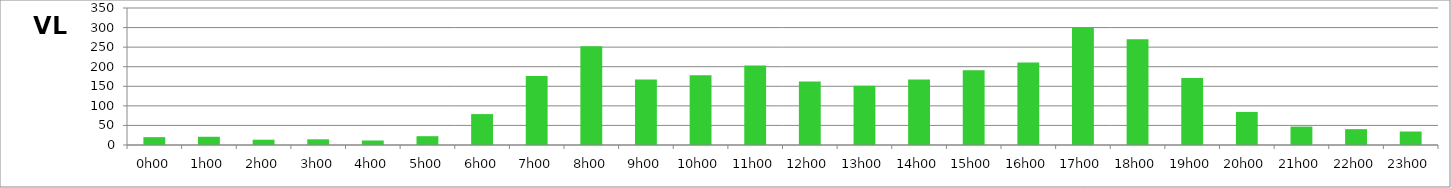
| Category | VL |
|---|---|
| 0.0 | 20 |
| 0.041666666666666664 | 21 |
| 0.08333333333333333 | 13.5 |
| 0.125 | 14.5 |
| 0.16666666666666666 | 11.5 |
| 0.20833333333333334 | 22.5 |
| 0.25 | 79 |
| 0.2916666666666667 | 176.5 |
| 0.3333333333333333 | 252.5 |
| 0.375 | 167.5 |
| 0.4166666666666667 | 178.5 |
| 0.4583333333333333 | 203 |
| 0.5 | 162 |
| 0.5416666666666666 | 151.5 |
| 0.5833333333333334 | 167.5 |
| 0.625 | 191 |
| 0.6666666666666666 | 211 |
| 0.7083333333333334 | 299.5 |
| 0.75 | 270 |
| 0.7916666666666666 | 171 |
| 0.8333333333333334 | 84.5 |
| 0.875 | 47 |
| 0.9166666666666666 | 40.5 |
| 0.9583333333333334 | 34.5 |